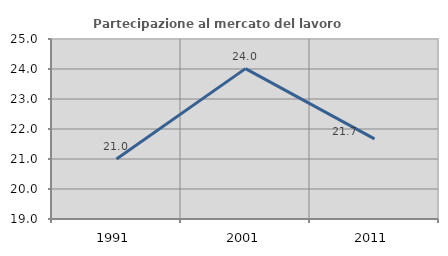
| Category | Partecipazione al mercato del lavoro  femminile |
|---|---|
| 1991.0 | 21.002 |
| 2001.0 | 24.012 |
| 2011.0 | 21.673 |